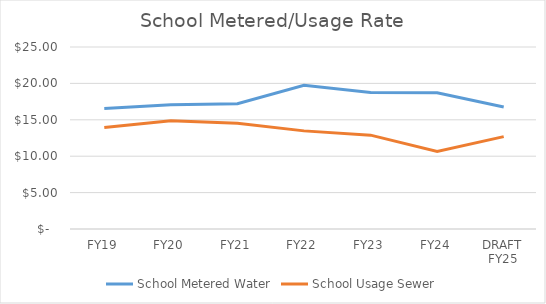
| Category | School Metered Water | School Usage Sewer |
|---|---|---|
| FY19 | 16.56 | 13.95 |
| FY20 | 17.054 | 14.859 |
| FY21 | 17.212 | 14.512 |
| FY22 | 19.739 | 13.479 |
| FY23 | 18.741 | 12.89 |
| FY24 | 18.723 | 10.656 |
| DRAFT FY25 | 16.76 | 12.69 |